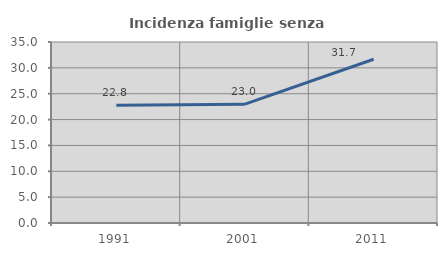
| Category | Incidenza famiglie senza nuclei |
|---|---|
| 1991.0 | 22.773 |
| 2001.0 | 22.981 |
| 2011.0 | 31.668 |